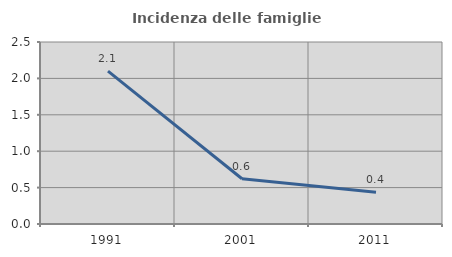
| Category | Incidenza delle famiglie numerose |
|---|---|
| 1991.0 | 2.099 |
| 2001.0 | 0.621 |
| 2011.0 | 0.436 |